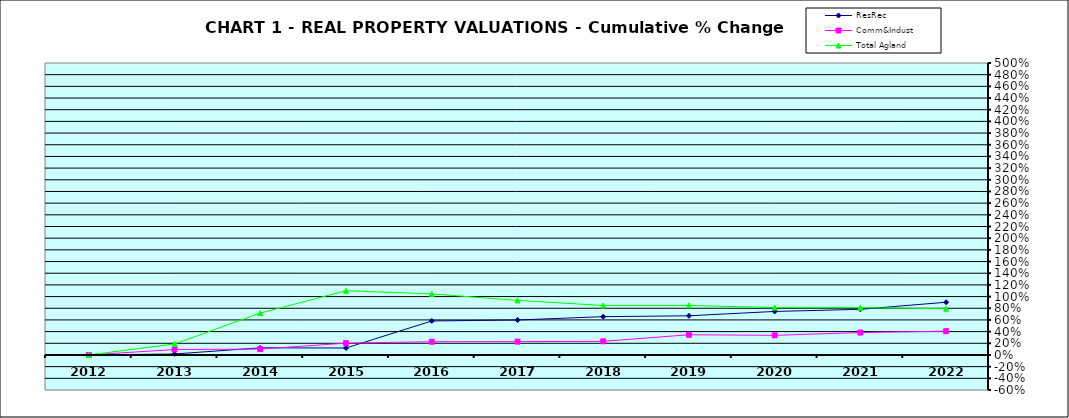
| Category | ResRec | Comm&Indust | Total Agland |
|---|---|---|---|
| 2012.0 | 0 | 0 | 0 |
| 2013.0 | 0.017 | 0.093 | 0.189 |
| 2014.0 | 0.122 | 0.101 | 0.717 |
| 2015.0 | 0.119 | 0.202 | 1.1 |
| 2016.0 | 0.582 | 0.227 | 1.046 |
| 2017.0 | 0.599 | 0.228 | 0.935 |
| 2018.0 | 0.656 | 0.234 | 0.848 |
| 2019.0 | 0.671 | 0.346 | 0.848 |
| 2020.0 | 0.745 | 0.336 | 0.812 |
| 2021.0 | 0.782 | 0.383 | 0.809 |
| 2022.0 | 0.903 | 0.408 | 0.792 |